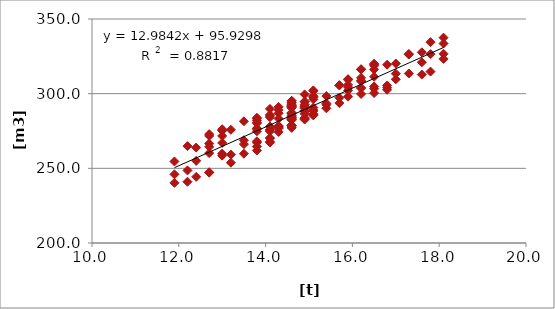
| Category | [m³] |
|---|---|
| 15.1 | 286.2 |
| 14.6 | 282.3 |
| 14.9 | 288.6 |
| 14.6 | 282.7 |
| 13.8 | 262 |
| 14.1 | 270.2 |
| 14.9 | 294.7 |
| 14.3 | 278.5 |
| 15.1 | 302.2 |
| 14.6 | 290.5 |
| 14.6 | 293.8 |
| 15.4 | 292.6 |
| 13.8 | 283.9 |
| 13.5 | 281.5 |
| 12.7 | 264.4 |
| 13.0 | 275.6 |
| 12.2 | 241 |
| 12.4 | 263.9 |
| 11.9 | 240.3 |
| 13.2 | 253.8 |
| 13.0 | 258.5 |
| 12.7 | 260.2 |
| 15.9 | 298 |
| 16.2 | 299.8 |
| 16.5 | 318.7 |
| 16.2 | 310.6 |
| 17.8 | 334.5 |
| 17.3 | 313.5 |
| 17.0 | 320.2 |
| 17.6 | 327.7 |
| 18.1 | 323.3 |
| 15.9 | 309.7 |
| 16.8 | 304 |
| 16.5 | 316.2 |
| 14.6 | 284 |
| 15.1 | 285.5 |
| 14.3 | 289.1 |
| 14.9 | 286.5 |
| 14.1 | 285.1 |
| 14.6 | 286.9 |
| 15.7 | 305.5 |
| 15.1 | 297.6 |
| 14.6 | 284 |
| 14.9 | 282.7 |
| 14.6 | 277.7 |
| 13.8 | 267.2 |
| 14.1 | 270.3 |
| 14.9 | 291.5 |
| 14.3 | 277.9 |
| 15.1 | 296.2 |
| 14.6 | 284.5 |
| 14.6 | 277.1 |
| 15.4 | 298.4 |
| 13.8 | 268.1 |
| 13.5 | 266.2 |
| 12.7 | 266.6 |
| 13.0 | 271.7 |
| 16.2 | 316.2 |
| 16.5 | 319.7 |
| 16.2 | 303.9 |
| 17.8 | 314.8 |
| 17.3 | 326.2 |
| 17.0 | 309.6 |
| 17.6 | 312.8 |
| 18.1 | 326.7 |
| 15.9 | 302.1 |
| 16.8 | 305.5 |
| 16.5 | 303.3 |
| 14.6 | 291.5 |
| 15.1 | 286.4 |
| 14.3 | 291.1 |
| 14.9 | 290.2 |
| 14.1 | 267.3 |
| 14.6 | 286.7 |
| 15.7 | 297.3 |
| 15.1 | 285.7 |
| 14.6 | 287.3 |
| 14.9 | 291.7 |
| 14.6 | 292.3 |
| 13.8 | 276.3 |
| 14.1 | 267.8 |
| 13.8 | 274.8 |
| 14.1 | 289.8 |
| 14.9 | 288 |
| 14.3 | 286.9 |
| 15.1 | 285.7 |
| 14.6 | 282.6 |
| 14.6 | 294 |
| 15.4 | 293.5 |
| 13.8 | 264.6 |
| 13.5 | 259.8 |
| 12.7 | 272.9 |
| 13.0 | 267 |
| 12.2 | 248.6 |
| 12.4 | 244.3 |
| 11.9 | 246 |
| 13.2 | 259.2 |
| 13.0 | 275.2 |
| 12.7 | 247.1 |
| 15.9 | 304.4 |
| 16.2 | 308.7 |
| 16.5 | 300.4 |
| 16.2 | 308.3 |
| 17.8 | 326.5 |
| 17.3 | 326.6 |
| 17.0 | 313.4 |
| 17.6 | 321 |
| 18.1 | 333.6 |
| 18.1 | 337.5 |
| 15.9 | 309.3 |
| 16.8 | 302.6 |
| 16.5 | 320 |
| 14.6 | 290.7 |
| 15.1 | 298.1 |
| 14.3 | 276.8 |
| 14.9 | 299.5 |
| 14.1 | 274.8 |
| 14.6 | 292.9 |
| 15.7 | 293.7 |
| 15.1 | 289 |
| 14.6 | 285.5 |
| 14.9 | 283.3 |
| 14.6 | 278.9 |
| 13.8 | 276.8 |
| 14.1 | 275.7 |
| 13.8 | 280.6 |
| 14.1 | 285.8 |
| 14.9 | 290.8 |
| 14.3 | 274.4 |
| 15.1 | 298.4 |
| 14.6 | 283.5 |
| 14.6 | 291.5 |
| 15.4 | 290.2 |
| 13.8 | 282 |
| 13.5 | 268.8 |
| 12.7 | 271.7 |
| 13.0 | 276.2 |
| 12.2 | 264.9 |
| 12.4 | 255 |
| 11.9 | 254.6 |
| 13.2 | 275.8 |
| 13.0 | 259.9 |
| 12.7 | 247.4 |
| 15.9 | 305.9 |
| 16.2 | 303.7 |
| 16.5 | 311.3 |
| 16.2 | 316.4 |
| 16.8 | 319.4 |
| 16.5 | 304.8 |
| 14.6 | 278.8 |
| 15.1 | 288.4 |
| 14.3 | 277.5 |
| 14.9 | 283.8 |
| 14.1 | 275.9 |
| 14.6 | 295.2 |
| 15.7 | 305.7 |
| 15.1 | 290.7 |
| 14.6 | 278.8 |
| 14.9 | 294.6 |
| 14.6 | 292 |
| 13.8 | 280.2 |
| 14.1 | 284.2 |
| 13.8 | 283.2 |
| 14.1 | 278 |
| 14.9 | 292.7 |
| 14.3 | 283.3 |
| 15.1 | 301.8 |
| 14.6 | 295.2 |